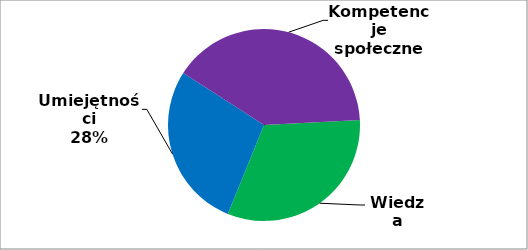
| Category | Series 0 |
|---|---|
| 0 | 87 |
| 1 | 76 |
| 2 | 109 |